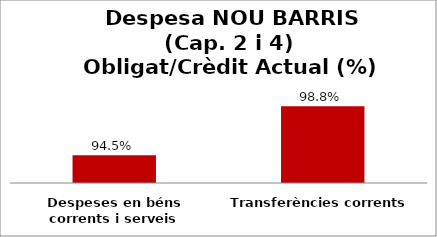
| Category | Series 0 |
|---|---|
| Despeses en béns corrents i serveis | 0.945 |
| Transferències corrents | 0.988 |